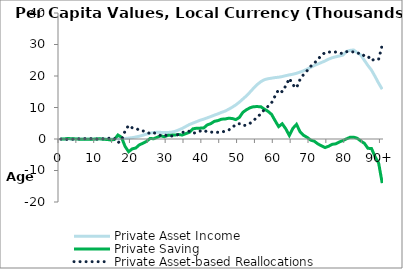
| Category | Private Asset Income | Private Saving | Private Asset-based Reallocations |
|---|---|---|---|
| 0 | 0 | 36.174 | -36.174 |
|  | 0 | 2.334 | -2.334 |
| 2 | 0 | 160.194 | -160.194 |
| 3 | 0 | 80.09 | -80.09 |
| 4 | 0 | 36.107 | -36.107 |
| 5 | 0 | -34.15 | 34.15 |
| 6 | 0 | -90.466 | 90.466 |
| 7 | 0 | -118.781 | 118.781 |
| 8 | 0 | -105.192 | 105.192 |
| 9 | 0 | -75.593 | 75.593 |
| 10 | 0 | 10.932 | -10.932 |
| 11 | 0 | 66.403 | -66.403 |
| 12 | 0 | -93.791 | 93.791 |
| 13 | 0 | -142.559 | 142.559 |
| 14 | 0 | -322.805 | 322.805 |
| 15 | 54.048 | -145.856 | 199.904 |
| 16 | 81.104 | 1276.695 | -1195.591 |
| 17 | 150.884 | 539.091 | -388.207 |
| 18 | 187.623 | -2363.762 | 2551.385 |
| 19 | 285.289 | -4038.61 | 4323.899 |
| 20 | 428.075 | -3134.215 | 3562.29 |
| 21 | 628.531 | -2857.18 | 3485.711 |
| 22 | 882.653 | -1852.115 | 2734.768 |
| 23 | 1199.35 | -1351.527 | 2550.877 |
| 24 | 1554.504 | -753.745 | 2308.249 |
| 25 | 1847.197 | 177.948 | 1669.249 |
| 26 | 2056.454 | 78.924 | 1977.53 |
| 27 | 2148.026 | 542.784 | 1605.242 |
| 28 | 2104.292 | 1034.836 | 1069.456 |
| 29 | 2068.998 | 714.744 | 1354.254 |
| 30 | 2078.308 | 1155.633 | 922.675 |
| 31 | 2164.456 | 1224.857 | 939.599 |
| 32 | 2435.193 | 1267.934 | 1167.259 |
| 33 | 2862.385 | 1417.189 | 1445.196 |
| 34 | 3356.264 | 1252.426 | 2103.838 |
| 35 | 3967.27 | 1696.832 | 2270.438 |
| 36 | 4589.749 | 2115.397 | 2474.352 |
| 37 | 5046.506 | 3224.753 | 1821.753 |
| 38 | 5492.454 | 3425.652 | 2066.802 |
| 39 | 5948.863 | 3447.738 | 2501.125 |
| 40 | 6299.557 | 3489.918 | 2809.639 |
| 41 | 6708.427 | 4467.143 | 2241.284 |
| 42 | 7127.363 | 4876.943 | 2250.42 |
| 43 | 7578.009 | 5614.771 | 1963.238 |
| 44 | 7981.117 | 5843.107 | 2138.01 |
| 45 | 8449.63 | 6293.032 | 2156.598 |
| 46 | 8849.465 | 6354.462 | 2495.003 |
| 47 | 9434.536 | 6590.349 | 2844.187 |
| 48 | 10082.03 | 6509.44 | 3572.59 |
| 49 | 10819.71 | 6158.194 | 4661.516 |
| 50 | 11691.15 | 6843.728 | 4847.422 |
| 51 | 12707.47 | 8484.554 | 4222.916 |
| 52 | 13718.23 | 9299.205 | 4419.025 |
| 53 | 14907.17 | 9920.744 | 4986.426 |
| 54 | 16151.22 | 10269.12 | 5882.1 |
| 55 | 17289.31 | 10284.8 | 7004.51 |
| 56 | 18190.62 | 10258.48 | 7932.14 |
| 57 | 18825.55 | 9481.964 | 9343.586 |
| 58 | 19129.34 | 8795.484 | 10333.856 |
| 59 | 19302.89 | 7844.947 | 11457.943 |
| 60 | 19498.95 | 5838.531 | 13660.419 |
| 61 | 19608.27 | 3933.295 | 15674.975 |
| 62 | 19824.25 | 4844.993 | 14979.257 |
| 63 | 20105.27 | 3224.145 | 16881.125 |
| 64 | 20351.99 | 1104.009 | 19247.981 |
| 65 | 20564.46 | 3405.822 | 17158.638 |
| 66 | 20848.56 | 4635.673 | 16212.887 |
| 67 | 21232.02 | 2306.488 | 18925.532 |
| 68 | 21661.9 | 1160.598 | 20501.302 |
| 69 | 22199.29 | 496.558 | 21702.732 |
| 70 | 22743.36 | -366.021 | 23109.381 |
| 71 | 23333.79 | -719.586 | 24053.376 |
| 72 | 23817.29 | -1561.046 | 25378.336 |
| 73 | 24298.88 | -2176.01 | 26474.89 |
| 74 | 24772.54 | -2714.766 | 27487.306 |
| 75 | 25350.84 | -2288.411 | 27639.251 |
| 76 | 25801.14 | -1685.583 | 27486.723 |
| 77 | 26100.93 | -1525.112 | 27626.042 |
| 78 | 26361.82 | -944.914 | 27306.734 |
| 79 | 26628.73 | -482.282 | 27111.012 |
| 80 | 27787.87 | 44.274 | 27743.596 |
| 81 | 28128.27 | 538.835 | 27589.435 |
| 82 | 28257.13 | 584.752 | 27672.378 |
| 83 | 27403.69 | 233.777 | 27169.913 |
| 84 | 26673.71 | -636.91 | 27310.62 |
| 85 | 24984.41 | -1365.46 | 26349.87 |
| 86 | 23323.69 | -2958.883 | 26282.573 |
| 87 | 21854.65 | -3011.589 | 24866.239 |
| 88 | 19839.4 | -5614.541 | 25453.941 |
| 89 | 17707.18 | -7652.168 | 25359.348 |
| 90+ | 15808.02 | -14011.94 | 29819.96 |